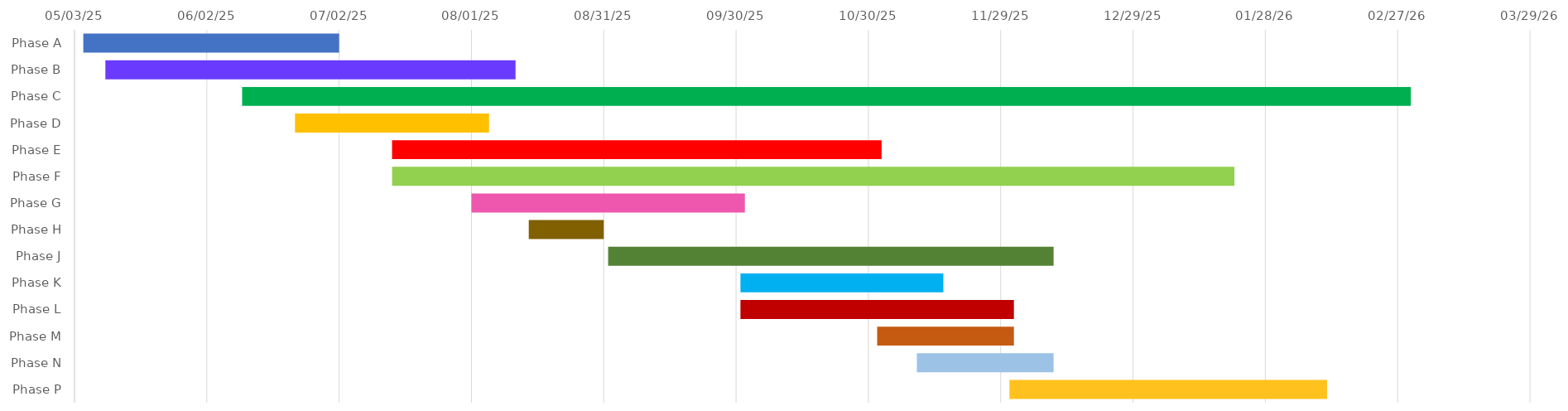
| Category | START 
DATE | Duration |
|---|---|---|
| Phase A | 2025-05-05 | 58 |
| Phase B | 2025-05-10 | 93 |
| Phase C | 2025-06-10 | 265 |
| Phase D | 2025-06-22 | 44 |
| Phase E | 2025-07-14 | 111 |
| Phase F | 2025-07-14 | 191 |
| Phase G | 2025-08-01 | 62 |
| Phase H | 2025-08-14 | 17 |
| Phase J | 2025-09-01 | 101 |
| Phase K | 2025-10-01 | 46 |
| Phase L | 2025-10-01 | 62 |
| Phase M | 2025-11-01 | 31 |
| Phase N | 2025-11-10 | 31 |
| Phase P | 2025-12-01 | 72 |